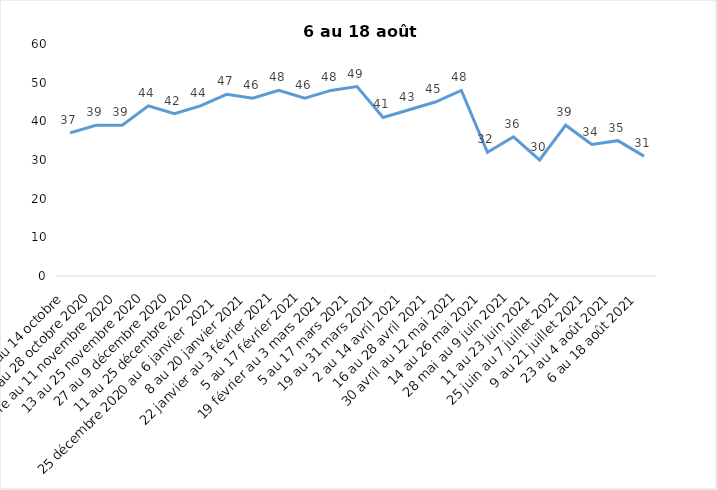
| Category | Toujours aux trois mesures |
|---|---|
| 2 au 14 octobre  | 37 |
| 16 au 28 octobre 2020 | 39 |
| 30 octobre au 11 novembre 2020 | 39 |
| 13 au 25 novembre 2020 | 44 |
| 27 au 9 décembre 2020 | 42 |
| 11 au 25 décembre 2020 | 44 |
| 25 décembre 2020 au 6 janvier  2021 | 47 |
| 8 au 20 janvier 2021 | 46 |
| 22 janvier au 3 février 2021 | 48 |
| 5 au 17 février 2021 | 46 |
| 19 février au 3 mars 2021 | 48 |
| 5 au 17 mars 2021 | 49 |
| 19 au 31 mars 2021 | 41 |
| 2 au 14 avril 2021 | 43 |
| 16 au 28 avril 2021 | 45 |
| 30 avril au 12 mai 2021 | 48 |
| 14 au 26 mai 2021 | 32 |
| 28 mai au 9 juin 2021 | 36 |
| 11 au 23 juin 2021 | 30 |
| 25 juin au 7 juillet 2021 | 39 |
| 9 au 21 juillet 2021 | 34 |
| 23 au 4 août 2021 | 35 |
| 6 au 18 août 2021 | 31 |